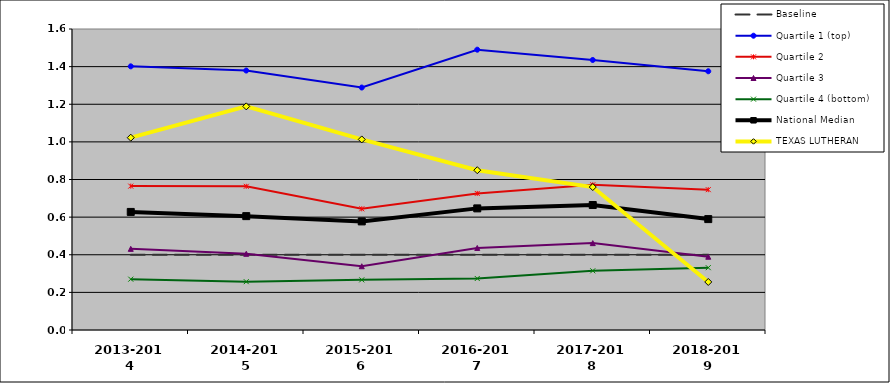
| Category | Baseline | Quartile 1 (top) | Quartile 2 | Quartile 3 | Quartile 4 (bottom) | National Median | TEXAS LUTHERAN |
|---|---|---|---|---|---|---|---|
| 2013-2014 | 0.4 | 1.401 | 0.765 | 0.431 | 0.27 | 0.628 | 1.022 |
| 2014-2015 | 0.4 | 1.379 | 0.764 | 0.405 | 0.257 | 0.605 | 1.189 |
| 2015-2016 | 0.4 | 1.289 | 0.644 | 0.339 | 0.267 | 0.577 | 1.013 |
| 2016-2017 | 0.4 | 1.49 | 0.726 | 0.436 | 0.274 | 0.646 | 0.849 |
| 2017-2018 | 0.4 | 1.435 | 0.772 | 0.462 | 0.315 | 0.664 | 0.76 |
| 2018-2019 | 0.4 | 1.375 | 0.746 | 0.389 | 0.331 | 0.59 | 0.255 |